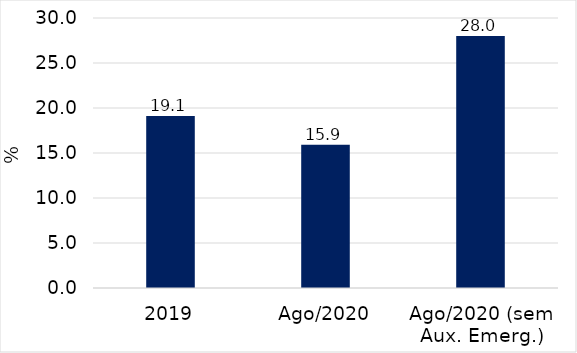
| Category | Series 0 |
|---|---|
| 2019 | 19.097 |
| Ago/2020 | 15.908 |
| Ago/2020 (sem Aux. Emerg.) | 27.991 |